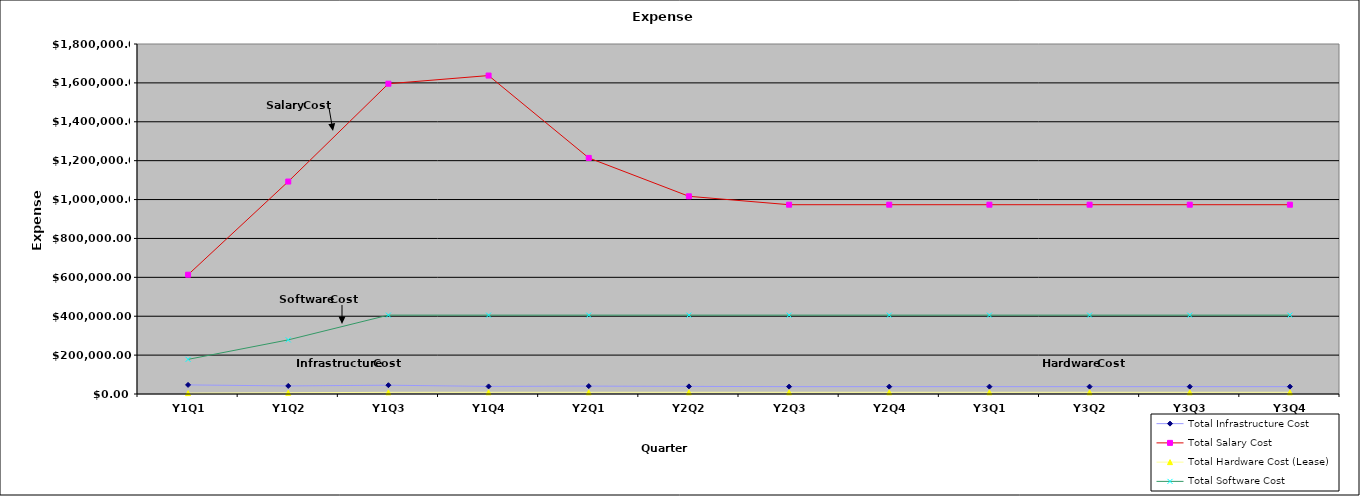
| Category | Total Infrastructure Cost | Total Salary Cost | Total Hardware Cost (Lease) | Total Software Cost |
|---|---|---|---|---|
| Y1Q1 | 46840 | 613500 | 4654.473 | 178100 |
| Y1Q2 | 41400 | 1092600 | 6498.007 | 278400 |
| Y1Q3 | 45270 | 1595700 | 8571.983 | 405700 |
| Y1Q4 | 38990 | 1637700 | 8802.425 | 405700 |
| Y2Q1 | 40530 | 1214100 | 8802.425 | 405700 |
| Y2Q2 | 39165 | 1016700 | 8802.425 | 405700 |
| Y2Q3 | 37800 | 973500 | 8802.425 | 405700 |
| Y2Q4 | 37800 | 973500 | 8802.425 | 405700 |
| Y3Q1 | 37800 | 973500 | 8802.425 | 405700 |
| Y3Q2 | 37800 | 973500 | 8802.425 | 405700 |
| Y3Q3 | 37800 | 973500 | 8802.425 | 405700 |
| Y3Q4 | 37800 | 973500 | 8802.425 | 405700 |